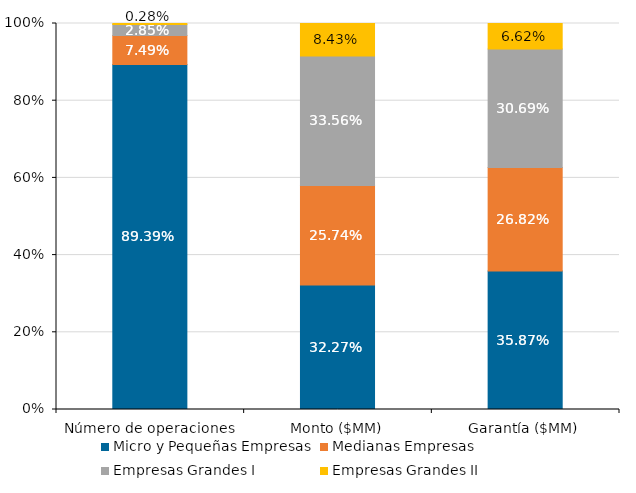
| Category | Micro y Pequeñas Empresas | Medianas Empresas | Empresas Grandes I | Empresas Grandes II |
|---|---|---|---|---|
| Número de operaciones | 0.894 | 0.075 | 0.028 | 0.003 |
| Monto ($MM) | 0.323 | 0.257 | 0.336 | 0.084 |
| Garantía ($MM) | 0.359 | 0.268 | 0.307 | 0.066 |